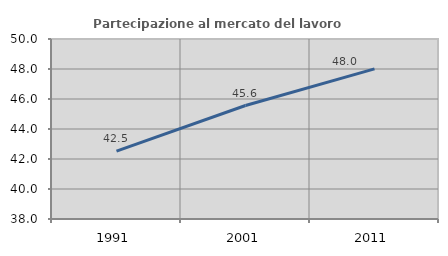
| Category | Partecipazione al mercato del lavoro  femminile |
|---|---|
| 1991.0 | 42.527 |
| 2001.0 | 45.566 |
| 2011.0 | 48.012 |